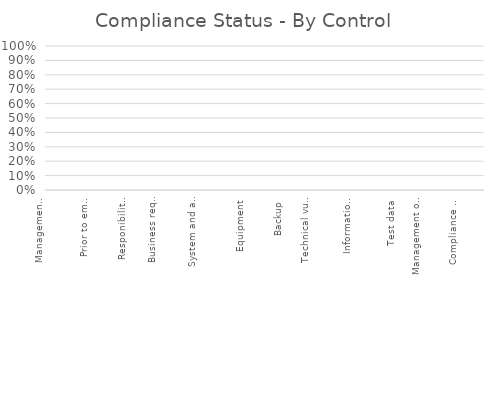
| Category | Status |
|---|---|
| Management direction for information security | 0 |
| Internal Organisation | 0 |
| Mobile devices and teleworking | 0 |
| Prior to employment | 0 |
| During employment | 0 |
| Termination and change of employment | 0 |
| Responibility for assets | 0 |
| Information classification | 0 |
| Media handling | 0 |
| Business requirements for access control | 0 |
| User access management | 0 |
| User responsibilities | 0 |
| System and application access control | 0 |
| Crypographic controls | 0 |
| Secure areas | 0 |
| Equipment | 0 |
| Operational procedures and responsibilities | 0 |
| Protection from malware | 0 |
| Backup | 0 |
| Logging and monitoring | 0 |
| Control of operational software | 0 |
| Technical vulnerability management | 0 |
| Information systems audit considerations | 0 |
| Network security management | 0 |
| Information transfer | 0 |
| Security requirements of information systems | 0 |
| Security in development and support processes | 0 |
| Test data | 0 |
| Information security in supplier relationships | 0 |
| Supplier service delivery management | 0 |
| Management of infosec incidents & improvements | 0 |
| Information security continuity | 0 |
| Redundancies | 0 |
| Compliance with legal and contractual requirements | 0 |
| Information security reviews | 0 |